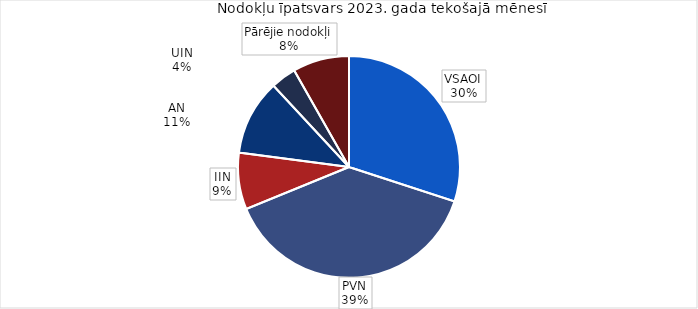
| Category | īpatsvars 2023 |
|---|---|
| VSAOI | 0.3 |
| PVN | 0.388 |
| IIN | 0.083 |
| AN | 0.11 |
| UIN | 0.037 |
| Pārējie nodokļi | 0.082 |